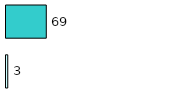
| Category | Series 0 | Series 1 |
|---|---|---|
| 0 | 3 | 69 |